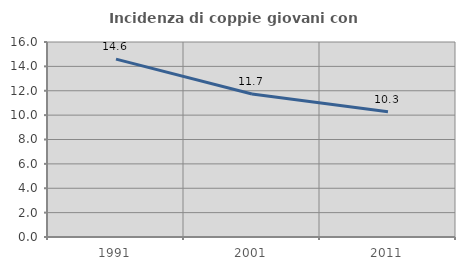
| Category | Incidenza di coppie giovani con figli |
|---|---|
| 1991.0 | 14.595 |
| 2001.0 | 11.728 |
| 2011.0 | 10.274 |